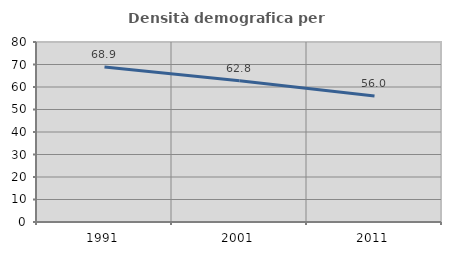
| Category | Densità demografica |
|---|---|
| 1991.0 | 68.855 |
| 2001.0 | 62.766 |
| 2011.0 | 56.033 |